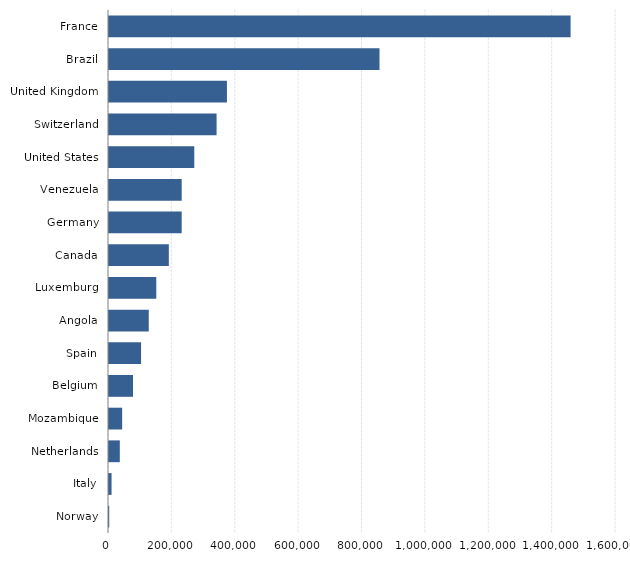
| Category | Series 0 |
|---|---|
| Norway | 767 |
| Italy | 8051 |
| Netherlands | 34118 |
| Mozambique | 41492 |
| Belgium | 75788 |
| Spain | 101185 |
| Angola | 125457 |
| Luxemburg | 149215 |
| Canada | 188826 |
| Germany | 229391 |
| Venezuela | 229405 |
| United States | 269118 |
| Switzerland | 339534 |
| United Kingdom | 372166 |
| Brazil | 853663 |
| France | 1456721 |